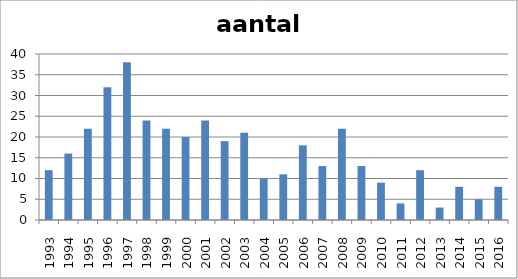
| Category | aantal tentoonstellingen |
|---|---|
| 1993.0 | 12 |
| 1994.0 | 16 |
| 1995.0 | 22 |
| 1996.0 | 32 |
| 1997.0 | 38 |
| 1998.0 | 24 |
| 1999.0 | 22 |
| 2000.0 | 20 |
| 2001.0 | 24 |
| 2002.0 | 19 |
| 2003.0 | 21 |
| 2004.0 | 10 |
| 2005.0 | 11 |
| 2006.0 | 18 |
| 2007.0 | 13 |
| 2008.0 | 22 |
| 2009.0 | 13 |
| 2010.0 | 9 |
| 2011.0 | 4 |
| 2012.0 | 12 |
| 2013.0 | 3 |
| 2014.0 | 8 |
| 2015.0 | 5 |
| 2016.0 | 8 |